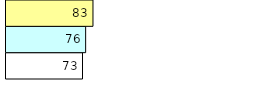
| Category | Total Standouts | Total Recd | Total Tipsters |
|---|---|---|---|
| 0 | 73 | 76 | 83 |